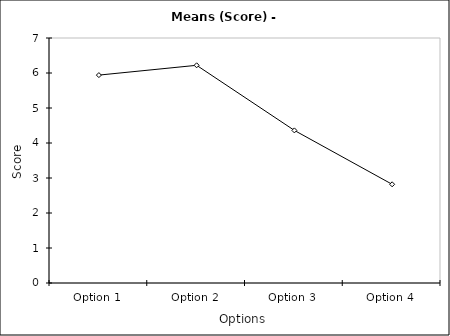
| Category | Series 0 |
|---|---|
| Option 1 | 5.94 |
| Option 2 | 6.22 |
| Option 3 | 4.36 |
| Option 4 | 2.82 |